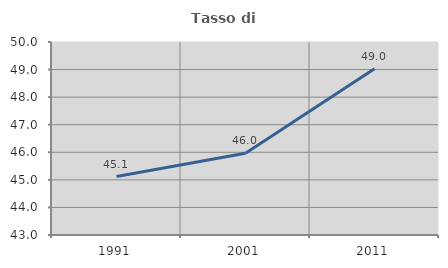
| Category | Tasso di occupazione   |
|---|---|
| 1991.0 | 45.12 |
| 2001.0 | 45.966 |
| 2011.0 | 49.032 |